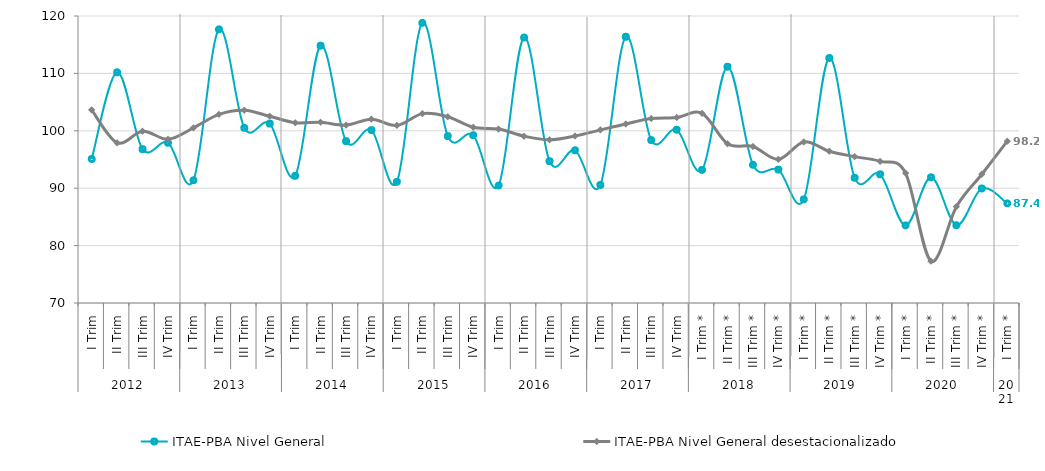
| Category | ITAE-PBA Nivel General | ITAE-PBA Nivel General desestacionalizado |
|---|---|---|
| 0 | 95.089 | 103.641 |
| 1 | 110.192 | 97.911 |
| 2 | 96.803 | 99.921 |
| 3 | 97.916 | 98.526 |
| 4 | 91.378 | 100.506 |
| 5 | 117.669 | 102.855 |
| 6 | 100.518 | 103.584 |
| 7 | 101.252 | 102.532 |
| 8 | 92.143 | 101.406 |
| 9 | 114.82 | 101.493 |
| 10 | 98.199 | 100.994 |
| 11 | 100.119 | 102.031 |
| 12 | 91.095 | 100.936 |
| 13 | 118.811 | 102.99 |
| 14 | 99.079 | 102.457 |
| 15 | 99.236 | 100.606 |
| 16 | 90.468 | 100.31 |
| 17 | 116.254 | 99.057 |
| 18 | 94.71 | 98.42 |
| 19 | 96.608 | 99.09 |
| 20 | 90.565 | 100.142 |
| 21 | 116.386 | 101.185 |
| 22 | 98.389 | 102.131 |
| 23 | 100.175 | 102.315 |
| 24 | 93.191 | 103.03 |
| 25 | 111.161 | 97.758 |
| 26 | 94.084 | 97.27 |
| 27 | 93.234 | 95.024 |
| 28 | 88.057 | 98.053 |
| 29 | 112.685 | 96.44 |
| 30 | 91.807 | 95.497 |
| 31 | 92.416 | 94.674 |
| 32 | 83.519 | 92.624 |
| 33 | 91.898 | 77.295 |
| 34 | 83.554 | 86.788 |
| 35 | 89.95 | 92.428 |
| 36 | 87.355 | 98.194 |